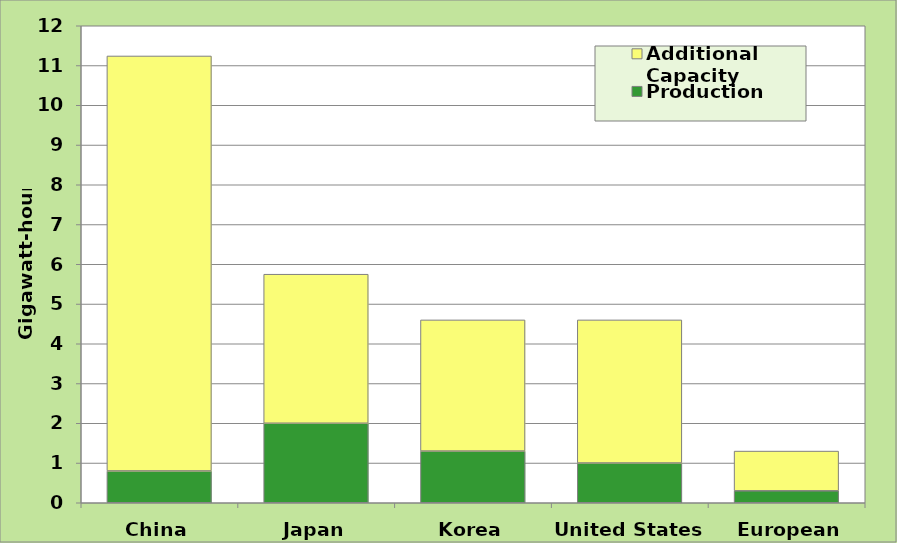
| Category | Production | Additional Capacity |
|---|---|---|
| China | 0.8 | 10.44 |
| Japan | 2 | 3.75 |
| Korea | 1.3 | 3.3 |
| United States | 1 | 3.6 |
| European Union | 0.3 | 1 |